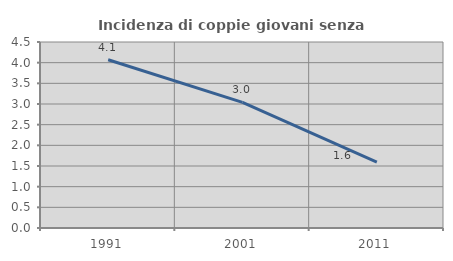
| Category | Incidenza di coppie giovani senza figli |
|---|---|
| 1991.0 | 4.07 |
| 2001.0 | 3.039 |
| 2011.0 | 1.596 |